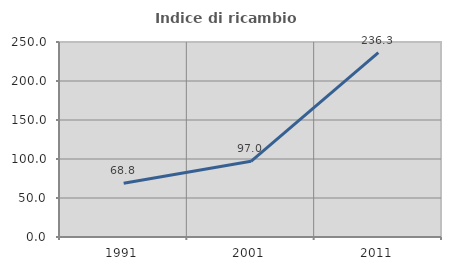
| Category | Indice di ricambio occupazionale  |
|---|---|
| 1991.0 | 68.809 |
| 2001.0 | 97.004 |
| 2011.0 | 236.339 |